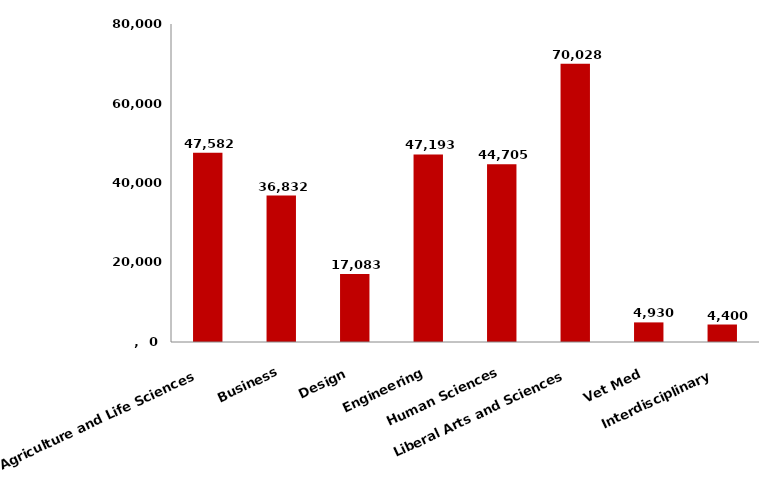
| Category | Series 0 |
|---|---|
| Agriculture and Life Sciences | 47582 |
| Business | 36832 |
| Design | 17083 |
| Engineering | 47193 |
| Human Sciences | 44705 |
| Liberal Arts and Sciences | 70028 |
| Vet Med | 4930 |
| Interdisciplinary | 4400 |